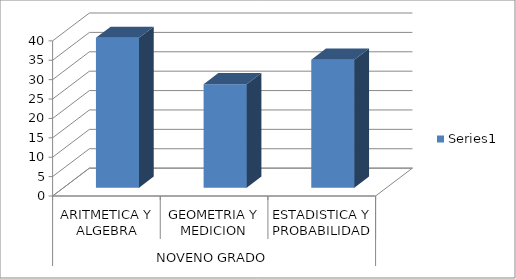
| Category | Series 0 |
|---|---|
| 0 | 38.63 |
| 1 | 26.66 |
| 2 | 32.99 |